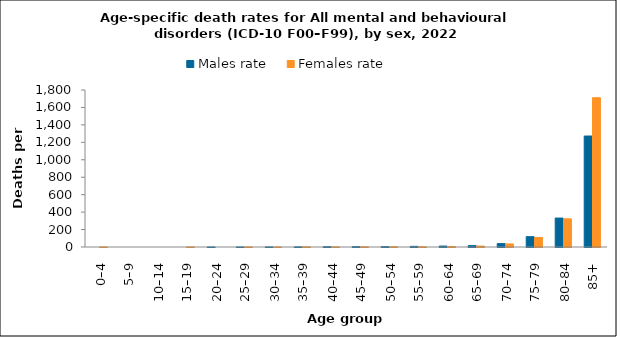
| Category | Males rate | Females rate |
|---|---|---|
| 0–4 | 0 | 0.136 |
| 5–9 | 0 | 0 |
| 10–14 | 0 | 0 |
| 15–19 | 0 | 0.135 |
| 20–24 | 0.236 | 0 |
| 25–29 | 0.216 | 0.222 |
| 30–34 | 0.633 | 0.207 |
| 35–39 | 1.17 | 1.153 |
| 40–44 | 3.089 | 0.927 |
| 45–49 | 3.86 | 1.342 |
| 50–54 | 4.423 | 2.739 |
| 55–59 | 7.157 | 2.307 |
| 60–64 | 10.889 | 5.737 |
| 65–69 | 16.419 | 10.805 |
| 70–74 | 39.008 | 35.032 |
| 75–79 | 118.231 | 109.65 |
| 80–84 | 331.943 | 323.081 |
| 85+ | 1272.362 | 1711.739 |